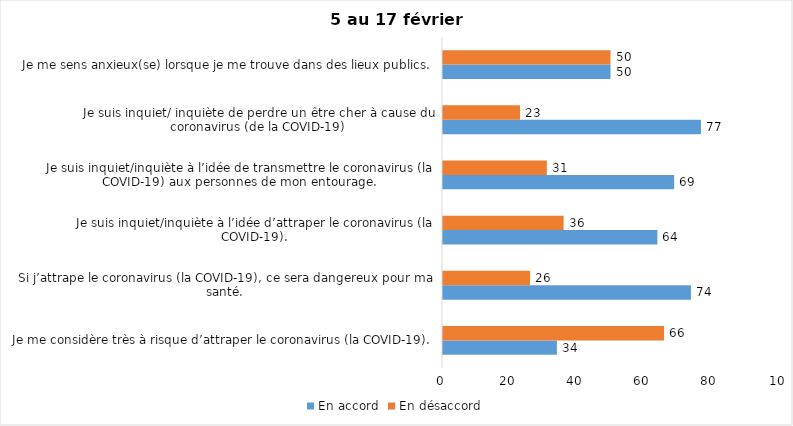
| Category | En accord | En désaccord |
|---|---|---|
| Je me considère très à risque d’attraper le coronavirus (la COVID-19). | 34 | 66 |
| Si j’attrape le coronavirus (la COVID-19), ce sera dangereux pour ma santé. | 74 | 26 |
| Je suis inquiet/inquiète à l’idée d’attraper le coronavirus (la COVID-19). | 64 | 36 |
| Je suis inquiet/inquiète à l’idée de transmettre le coronavirus (la COVID-19) aux personnes de mon entourage. | 69 | 31 |
| Je suis inquiet/ inquiète de perdre un être cher à cause du coronavirus (de la COVID-19) | 77 | 23 |
| Je me sens anxieux(se) lorsque je me trouve dans des lieux publics. | 50 | 50 |